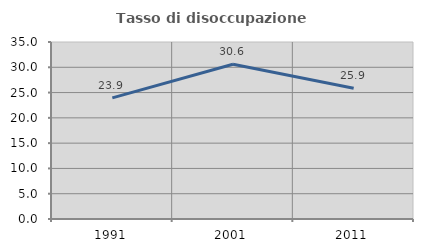
| Category | Tasso di disoccupazione giovanile  |
|---|---|
| 1991.0 | 23.944 |
| 2001.0 | 30.612 |
| 2011.0 | 25.862 |